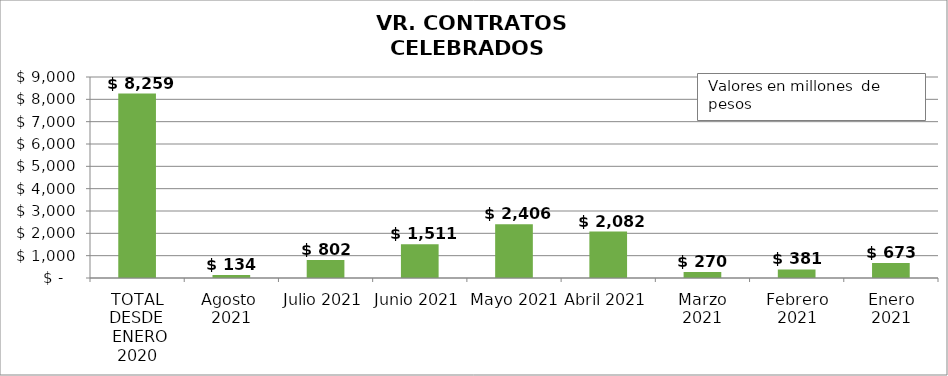
| Category | TOTAL EN URABA |
|---|---|
| TOTAL DESDE
 ENERO 2020 | 8259.372 |
| Agosto  2021 | 133.601 |
| Julio 2021 | 802.495 |
| Junio 2021 | 1511.254 |
| Mayo 2021 | 2406.243 |
| Abril 2021 | 2081.76 |
| Marzo 2021 | 269.593 |
| Febrero 2021 | 381.32 |
| Enero 2021 | 673.106 |